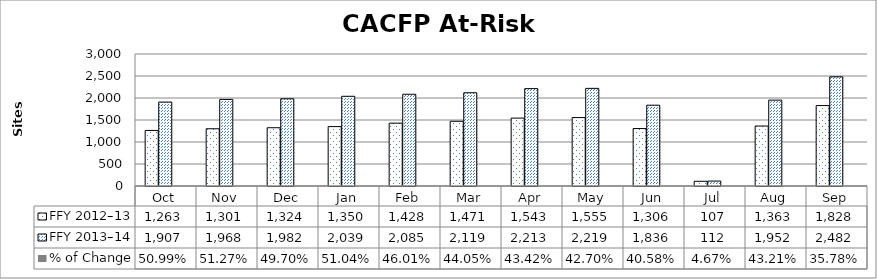
| Category | FFY 2012–13 | FFY 2013–14 | % of Change |
|---|---|---|---|
| Oct | 1263 | 1907 | 0.51 |
| Nov | 1301 | 1968 | 0.513 |
| Dec | 1324 | 1982 | 0.497 |
| Jan | 1350 | 2039 | 0.51 |
| Feb | 1428 | 2085 | 0.46 |
| Mar | 1471 | 2119 | 0.441 |
| Apr | 1543 | 2213 | 0.434 |
| May | 1555 | 2219 | 0.427 |
| Jun | 1306 | 1836 | 0.406 |
| Jul | 107 | 112 | 0.047 |
| Aug | 1363 | 1952 | 0.432 |
| Sep | 1828 | 2482 | 0.358 |